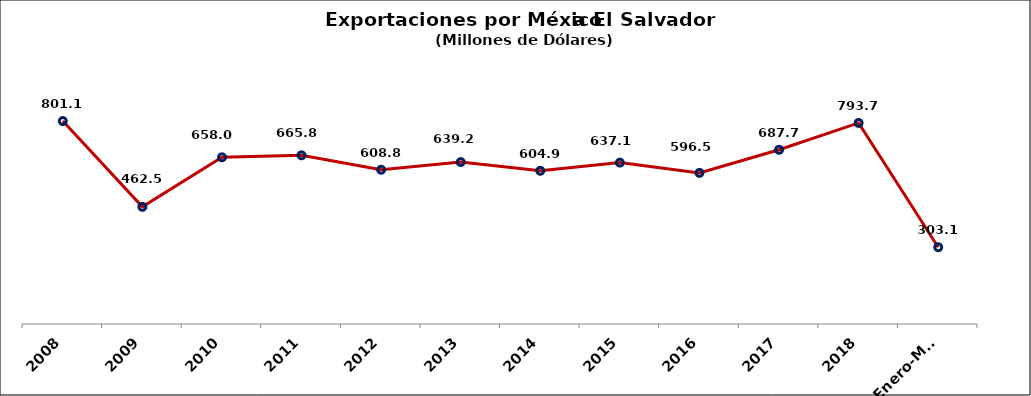
| Category | Series 0 |
|---|---|
| 2008 | 801.078 |
| 2009 | 462.48 |
| 2010 | 658.022 |
| 2011 | 665.814 |
| 2012 | 608.844 |
| 2013 | 639.219 |
| 2014 | 604.85 |
| 2015 | 637.064 |
| 2016 | 596.514 |
| 2017 | 687.7 |
| 2018 | 793.7 |
| 2019 Enero-Mayo | 303.1 |